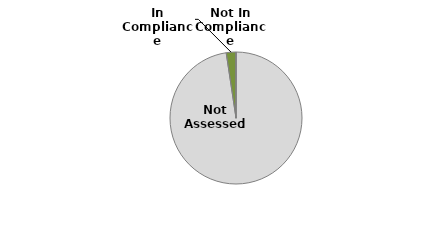
| Category | Series 0 |
|---|---|
| Not Assessed | 41 |
| In Compliance | 1 |
| Not In Compliance | 0 |